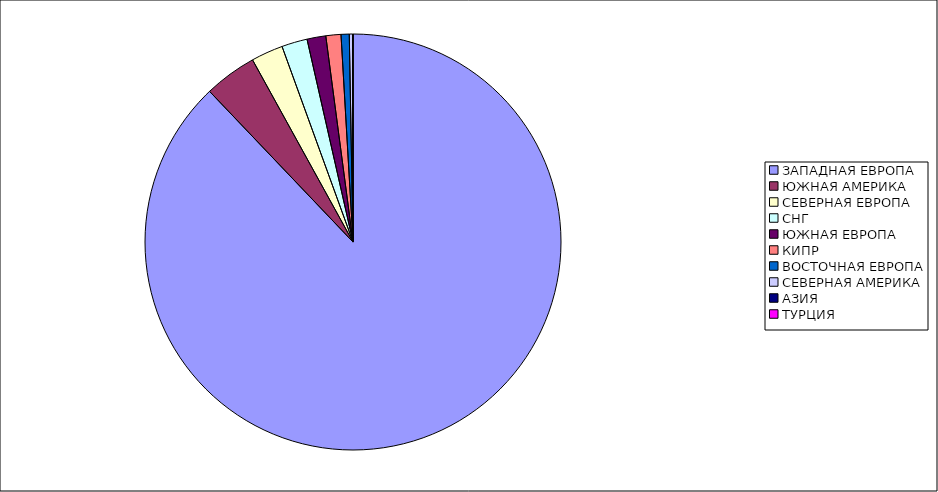
| Category | Оборот |
|---|---|
| ЗАПАДНАЯ ЕВРОПА | 0.879 |
| ЮЖНАЯ АМЕРИКА | 0.041 |
| СЕВЕРНАЯ ЕВРОПА | 0.025 |
| СНГ | 0.02 |
| ЮЖНАЯ ЕВРОПА | 0.015 |
| КИПР | 0.012 |
| ВОСТОЧНАЯ ЕВРОПА | 0.006 |
| СЕВЕРНАЯ АМЕРИКА | 0.003 |
| АЗИЯ | 0 |
| ТУРЦИЯ | 0 |